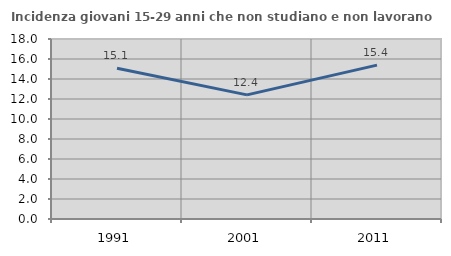
| Category | Incidenza giovani 15-29 anni che non studiano e non lavorano  |
|---|---|
| 1991.0 | 15.079 |
| 2001.0 | 12.415 |
| 2011.0 | 15.385 |